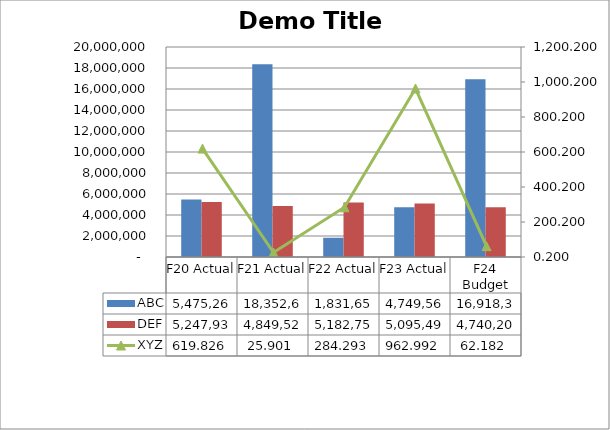
| Category | ABC | DEF |
|---|---|---|
| F20 Actual | 5475263.645 | 5247939.305 |
| F21 Actual | 18352616.026 | 4849529.306 |
| F22 Actual | 1831650.424 | 5182755.464 |
| F23 Actual | 4749564.117 | 5095490.587 |
| F24 Budget | 16918381.745 | 4740208.767 |